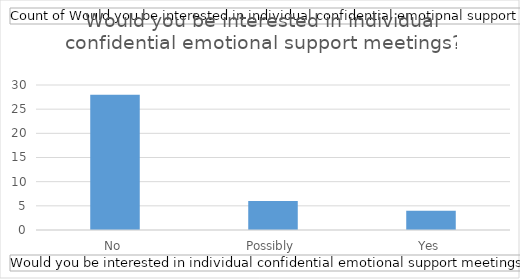
| Category | Total |
|---|---|
| No | 28 |
| Possibly | 6 |
| Yes | 4 |